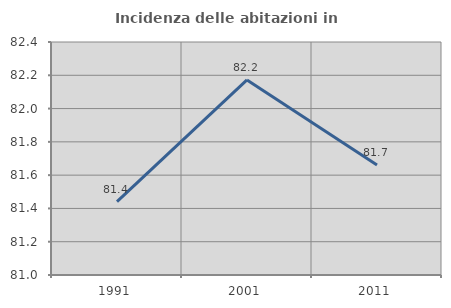
| Category | Incidenza delle abitazioni in proprietà  |
|---|---|
| 1991.0 | 81.44 |
| 2001.0 | 82.172 |
| 2011.0 | 81.661 |